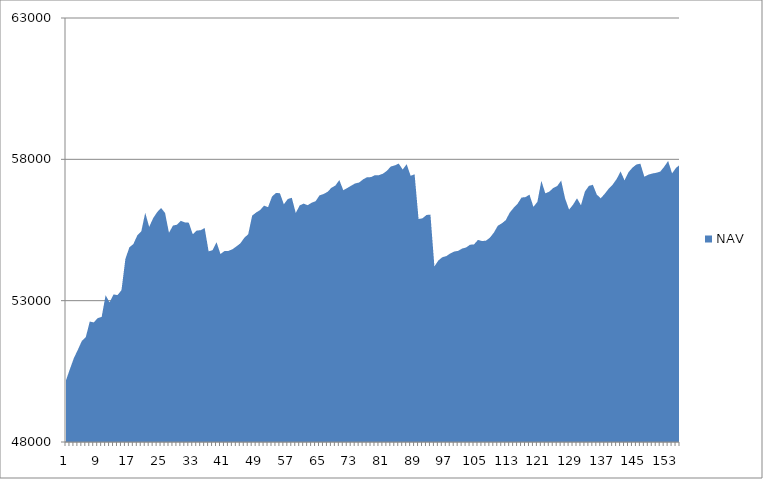
| Category | NAV |
|---|---|
| 0 | 50185.185 |
| 1 | 50585.185 |
| 2 | 50973.977 |
| 3 | 51265.977 |
| 4 | 51576.741 |
| 5 | 51711.523 |
| 6 | 52262.893 |
| 7 | 52230.24 |
| 8 | 52381.556 |
| 9 | 52425.915 |
| 10 | 53192.581 |
| 11 | 52939.146 |
| 12 | 53220.069 |
| 13 | 53197.341 |
| 14 | 53369.61 |
| 15 | 54480.721 |
| 16 | 54888.365 |
| 17 | 55001.902 |
| 18 | 55308.308 |
| 19 | 55448.308 |
| 20 | 56110.305 |
| 21 | 55610.305 |
| 22 | 55916.954 |
| 23 | 56129.798 |
| 24 | 56279.798 |
| 25 | 56105.301 |
| 26 | 55401.645 |
| 27 | 55657.201 |
| 28 | 55686.925 |
| 29 | 55823.001 |
| 30 | 55769.596 |
| 31 | 55759.375 |
| 32 | 55350.284 |
| 33 | 55480.284 |
| 34 | 55492.498 |
| 35 | 55570.42 |
| 36 | 54746.89 |
| 37 | 54783.7 |
| 38 | 55066.459 |
| 39 | 54651.074 |
| 40 | 54754.078 |
| 41 | 54760.213 |
| 42 | 54816.924 |
| 43 | 54917.296 |
| 44 | 55025.73 |
| 45 | 55220.535 |
| 46 | 55353.465 |
| 47 | 56009.309 |
| 48 | 56118.959 |
| 49 | 56205.212 |
| 50 | 56362.876 |
| 51 | 56307.394 |
| 52 | 56678.935 |
| 53 | 56813.264 |
| 54 | 56799.502 |
| 55 | 56409.112 |
| 56 | 56596.44 |
| 57 | 56640.493 |
| 58 | 56102.227 |
| 59 | 56370.449 |
| 60 | 56434.248 |
| 61 | 56376.841 |
| 62 | 56464.524 |
| 63 | 56518.022 |
| 64 | 56724.747 |
| 65 | 56770.361 |
| 66 | 56848.099 |
| 67 | 56992.896 |
| 68 | 57073.571 |
| 69 | 57266.481 |
| 70 | 56908.016 |
| 71 | 56984.939 |
| 72 | 57069.276 |
| 73 | 57147.627 |
| 74 | 57179.83 |
| 75 | 57291.17 |
| 76 | 57366.35 |
| 77 | 57371.599 |
| 78 | 57439.215 |
| 79 | 57440.895 |
| 80 | 57490.895 |
| 81 | 57593.679 |
| 82 | 57746.643 |
| 83 | 57785.413 |
| 84 | 57849.748 |
| 85 | 57639.346 |
| 86 | 57828.82 |
| 87 | 57417.055 |
| 88 | 57471.335 |
| 89 | 55888.376 |
| 90 | 55913.907 |
| 91 | 56031.989 |
| 92 | 56044.711 |
| 93 | 54210.631 |
| 94 | 54422.612 |
| 95 | 54536.647 |
| 96 | 54575.903 |
| 97 | 54670.229 |
| 98 | 54737.367 |
| 99 | 54762.386 |
| 100 | 54842.923 |
| 101 | 54881.385 |
| 102 | 54978.816 |
| 103 | 54991.283 |
| 104 | 55149.699 |
| 105 | 55109.498 |
| 106 | 55121.656 |
| 107 | 55227.569 |
| 108 | 55405.15 |
| 109 | 55650.183 |
| 110 | 55733.424 |
| 111 | 55846.244 |
| 112 | 56110.95 |
| 113 | 56283.172 |
| 114 | 56430.541 |
| 115 | 56648.489 |
| 116 | 56663.919 |
| 117 | 56752.272 |
| 118 | 56318.108 |
| 119 | 56496.442 |
| 120 | 57240.145 |
| 121 | 56797.081 |
| 122 | 56857.303 |
| 123 | 56985.874 |
| 124 | 57053.805 |
| 125 | 57249.117 |
| 126 | 56612.311 |
| 127 | 56221.507 |
| 128 | 56394.346 |
| 129 | 56622.008 |
| 130 | 56375.255 |
| 131 | 56862.384 |
| 132 | 57060.137 |
| 133 | 57099.524 |
| 134 | 56750.37 |
| 135 | 56622.71 |
| 136 | 56780.605 |
| 137 | 56961.84 |
| 138 | 57105.4 |
| 139 | 57301.96 |
| 140 | 57570.545 |
| 141 | 57256.886 |
| 142 | 57545.679 |
| 143 | 57705.679 |
| 144 | 57817.679 |
| 145 | 57845.512 |
| 146 | 57383.973 |
| 147 | 57457.609 |
| 148 | 57498.333 |
| 149 | 57523.57 |
| 150 | 57565.004 |
| 151 | 57735.592 |
| 152 | 57941.474 |
| 153 | 57502.813 |
| 154 | 57699.914 |
| 155 | 57809.005 |